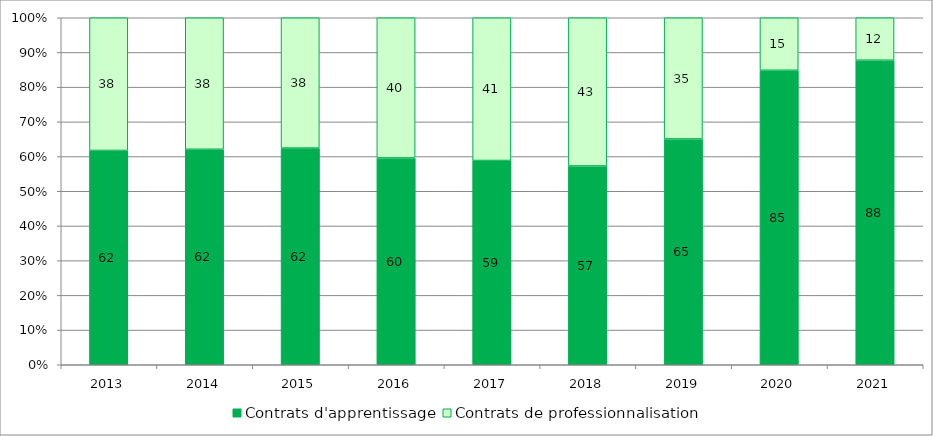
| Category | Contrats d'apprentissage | Contrats de professionnalisation |
|---|---|---|
| 2013.0 | 61.759 | 38.241 |
| 2014.0 | 62.1 | 37.9 |
| 2015.0 | 62.451 | 37.549 |
| 2016.0 | 59.609 | 40.391 |
| 2017.0 | 58.86 | 41.14 |
| 2018.0 | 57.292 | 42.708 |
| 2019.0 | 65.081 | 34.919 |
| 2020.0 | 84.871 | 15.129 |
| 2021.0 | 87.765 | 12.235 |